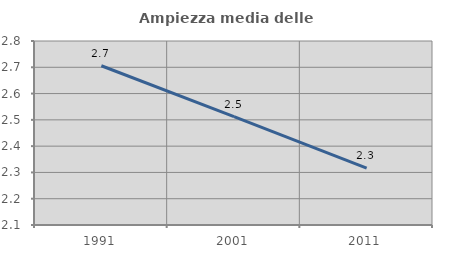
| Category | Ampiezza media delle famiglie |
|---|---|
| 1991.0 | 2.706 |
| 2001.0 | 2.513 |
| 2011.0 | 2.316 |